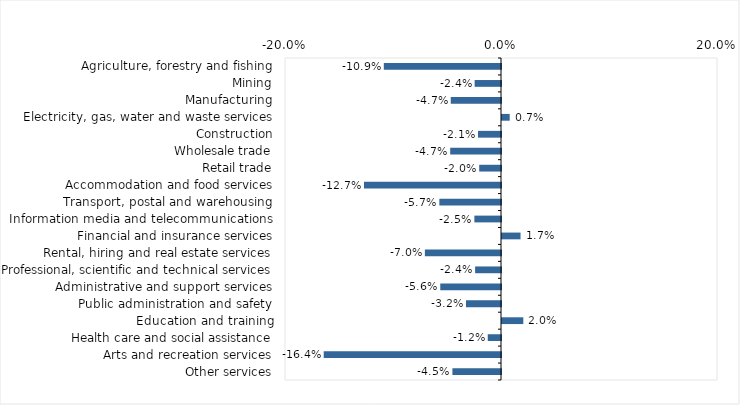
| Category | This week |
|---|---|
| Agriculture, forestry and fishing | -0.109 |
| Mining | -0.024 |
| Manufacturing | -0.047 |
| Electricity, gas, water and waste services | 0.007 |
| Construction | -0.021 |
| Wholesale trade | -0.047 |
| Retail trade | -0.02 |
| Accommodation and food services | -0.127 |
| Transport, postal and warehousing | -0.057 |
| Information media and telecommunications | -0.025 |
| Financial and insurance services | 0.017 |
| Rental, hiring and real estate services | -0.07 |
| Professional, scientific and technical services | -0.024 |
| Administrative and support services | -0.056 |
| Public administration and safety | -0.032 |
| Education and training | 0.02 |
| Health care and social assistance | -0.012 |
| Arts and recreation services | -0.164 |
| Other services | -0.045 |